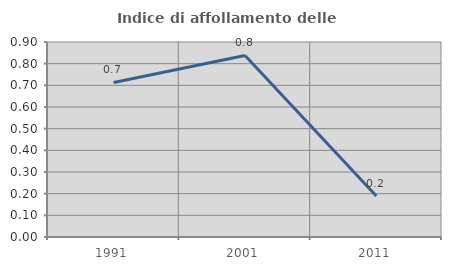
| Category | Indice di affollamento delle abitazioni  |
|---|---|
| 1991.0 | 0.713 |
| 2001.0 | 0.838 |
| 2011.0 | 0.189 |